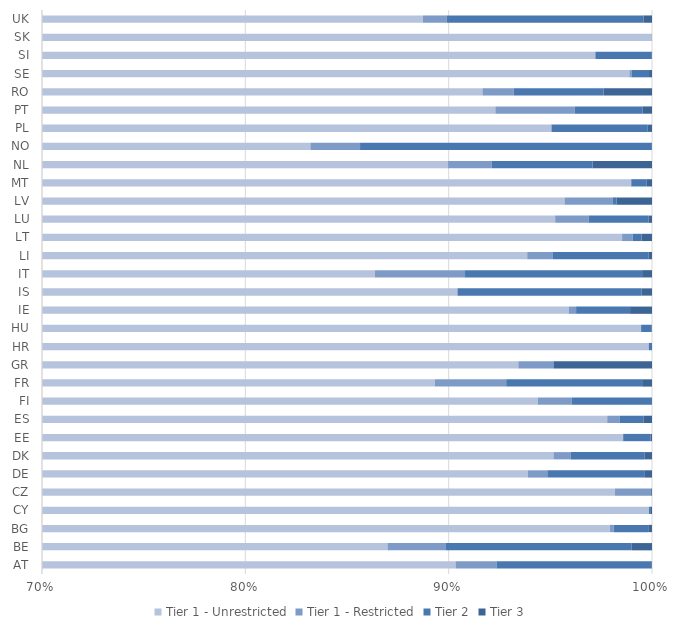
| Category | Tier 1 - Unrestricted | Tier 1 - Restricted | Tier 2 | Tier 3 |
|---|---|---|---|---|
| AT | 33688.72 | 750.41 | 2848.94 | 3 |
| BE | 29537.37 | 966.62 | 3105.87 | 343.87 |
| BG | 1338.92 | 2.51 | 23.23 | 2.52 |
| CY | 1266.41 | 0 | 0.75 | 1.11 |
| CZ | 4421.57 | 80.48 | 0 | 1.79 |
| DE | 451348.22 | 4593.16 | 22917.09 | 1831.44 |
| DK | 40316.48 | 354.16 | 1539.54 | 159.43 |
| EE | 584.81 | 0 | 8 | 0.41 |
| ES | 49007.49 | 302.28 | 589.83 | 211.44 |
| FI | 11666.53 | 205 | 489.24 | 0.03 |
| FR | 313597.02 | 12306.83 | 23473.62 | 1700.83 |
| GR | 2924.86 | 53.7 | 0.8 | 151.35 |
| HR | 1558.21 | 0 | 2.45 | 0 |
| HU | 1703.36 | 0 | 8.87 | 0.3 |
| IE | 37382.32 | 141.86 | 1034.55 | 420.16 |
| IS | 378.33 | 0 | 37.85 | 2.17 |
| IT | 111118.89 | 5709.02 | 11206.61 | 624.47 |
| LI | 3039.36 | 40.97 | 152.07 | 5.68 |
| LT | 359.05 | 1.92 | 1.58 | 1.86 |
| LU | 21132.64 | 365.02 | 655.87 | 35.96 |
| LV | 153.99 | 3.83 | 0.28 | 2.81 |
| MT | 4650.95 | 0.95 | 34.81 | 13.05 |
| NL | 51901.54 | 1240.34 | 2858.31 | 1686.52 |
| NO | 19380.64 | 568.89 | 3343.06 | 1.47 |
| PL | 14633.87 | 4.76 | 724.34 | 35.09 |
| PT | 6220.11 | 263.36 | 223.99 | 31.84 |
| RO | 1020.58 | 17.11 | 49.22 | 26.5 |
| SE | 75042.58 | 85.75 | 645.04 | 110.03 |
| SI | 2492.46 | 1.5 | 70.5 | 0.22 |
| SK | 1336.16 | 0.3 | 0 | 0 |
| UK | 184420.12 | 2411.55 | 20128.01 | 871.66 |